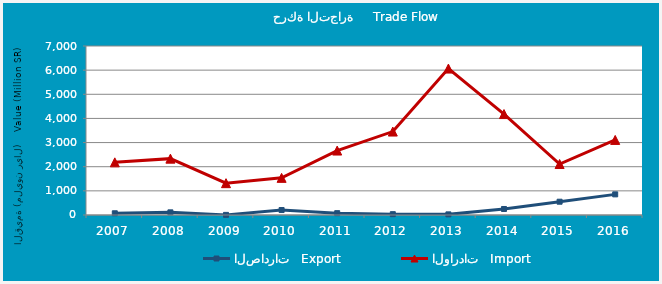
| Category | الصادرات   Export | الواردات   Import |
|---|---|---|
| 2007.0 | 71.282 | 2181.281 |
| 2008.0 | 109.389 | 2334.39 |
| 2009.0 | 5.101 | 1318.385 |
| 2010.0 | 205.757 | 1538.234 |
| 2011.0 | 76.054 | 2669.422 |
| 2012.0 | 34.371 | 3456.008 |
| 2013.0 | 26.281 | 6065.409 |
| 2014.0 | 248.839 | 4180.753 |
| 2015.0 | 550.709 | 2111.673 |
| 2016.0 | 854.367 | 3109.391 |